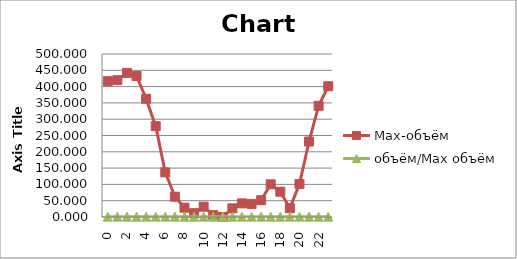
| Category | Max-объём | объём/Max объём |
|---|---|---|
| 0.0 | 416.72 | 0.887 |
| 1.0 | 419.795 | 0.886 |
| 2.0 | 441.994 | 0.88 |
| 3.0 | 432.618 | 0.883 |
| 4.0 | 362.666 | 0.902 |
| 5.0 | 278.708 | 0.925 |
| 6.0 | 136.992 | 0.963 |
| 7.0 | 62.223 | 0.983 |
| 8.0 | 28.567 | 0.992 |
| 9.0 | 11.808 | 0.997 |
| 10.0 | 31.688 | 0.991 |
| 11.0 | 5.71 | 0.998 |
| 12.0 | 0 | 1 |
| 13.0 | 26.545 | 0.993 |
| 14.0 | 41.751 | 0.989 |
| 15.0 | 40.177 | 0.989 |
| 16.0 | 51.598 | 0.986 |
| 17.0 | 100.3 | 0.973 |
| 18.0 | 77.533 | 0.979 |
| 19.0 | 27.096 | 0.993 |
| 20.0 | 101.299 | 0.973 |
| 21.0 | 231.498 | 0.937 |
| 22.0 | 340.948 | 0.908 |
| 23.0 | 401.079 | 0.891 |